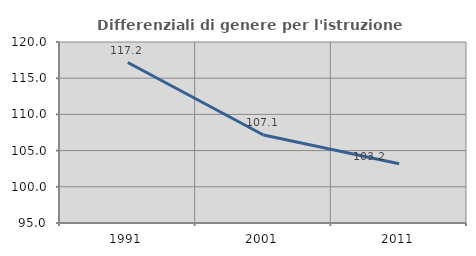
| Category | Differenziali di genere per l'istruzione superiore |
|---|---|
| 1991.0 | 117.161 |
| 2001.0 | 107.148 |
| 2011.0 | 103.187 |